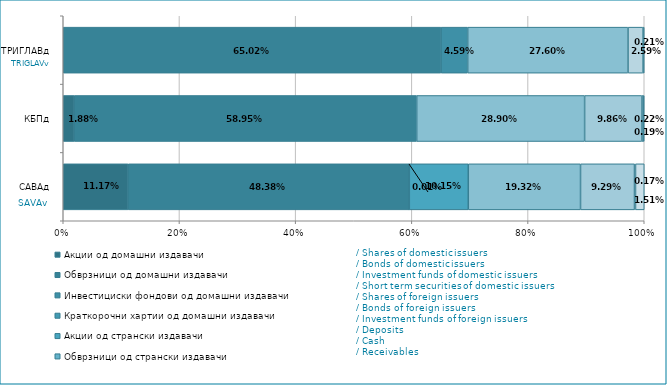
| Category | Акции од домашни издавачи  | Обврзници од домашни издавачи  | Инвестициски фондови од домашни издавачи   | Краткорочни хартии од домашни издавачи   | Акции од странски издавачи   | Обврзници од странски издавачи  | Инвестициски фондови од странски издавчи  | Депозити | Парични средства | Побарувања |
|---|---|---|---|---|---|---|---|---|---|---|
| САВАд | 0.112 | 0.484 | 0 | 0 | 0.101 | 0 | 0.193 | 0.093 | 0.002 | 0.015 |
| КБПд | 0.019 | 0.589 | 0 | 0 | 0 | 0 | 0.289 | 0.099 | 0.002 | 0.002 |
| ТРИГЛАВд | 0 | 0.65 | 0.046 | 0 | 0 | 0 | 0.276 | 0 | 0.026 | 0.002 |